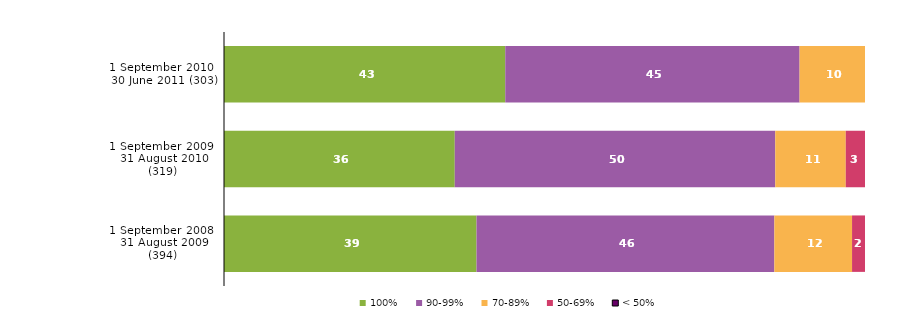
| Category | 100% | 90-99% | 70-89% | 50-69% | < 50% |
|---|---|---|---|---|---|
| 1 September 2010 - 30 June 2011 (303) | 43 | 45 | 10 | 0 | 0 |
| 1 September 2009 - 31 August 2010 (319) | 36 | 50 | 11 | 3 | 0 |
| 1 September 2008 - 31 August 2009 (394) | 39 | 46 | 12 | 2 | 0 |